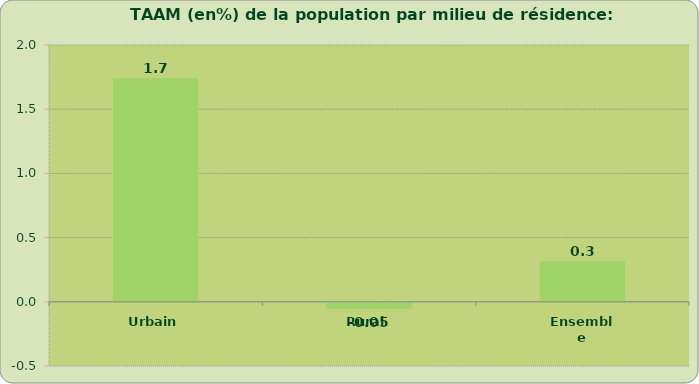
| Category | 2014-2030 |
|---|---|
| Urbain | 1.744 |
| Rural | -0.047 |
| Ensemble | 0.315 |